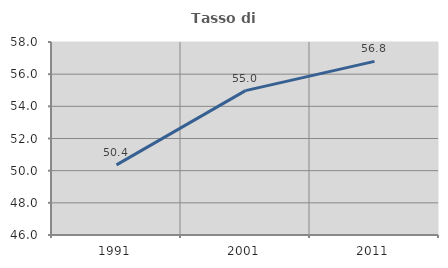
| Category | Tasso di occupazione   |
|---|---|
| 1991.0 | 50.36 |
| 2001.0 | 54.975 |
| 2011.0 | 56.796 |